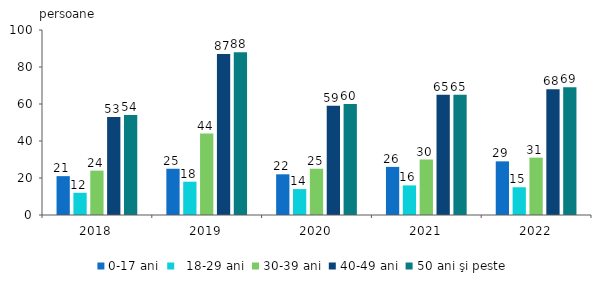
| Category | 0-17 ani |   18-29 ani | 30-39 ani | 40-49 ani | 50 ani şi peste |
|---|---|---|---|---|---|
| 2018.0 | 21 | 12 | 24 | 53 | 54 |
| 2019.0 | 25 | 18 | 44 | 87 | 88 |
| 2020.0 | 22 | 14 | 25 | 59 | 60 |
| 2021.0 | 26 | 16 | 30 | 65 | 65 |
| 2022.0 | 29 | 15 | 31 | 68 | 69 |